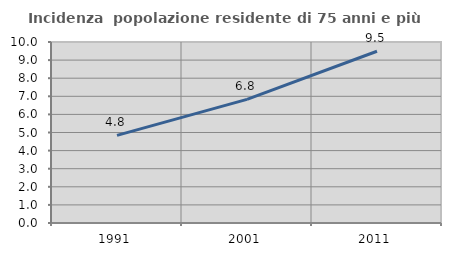
| Category | Incidenza  popolazione residente di 75 anni e più |
|---|---|
| 1991.0 | 4.843 |
| 2001.0 | 6.832 |
| 2011.0 | 9.487 |